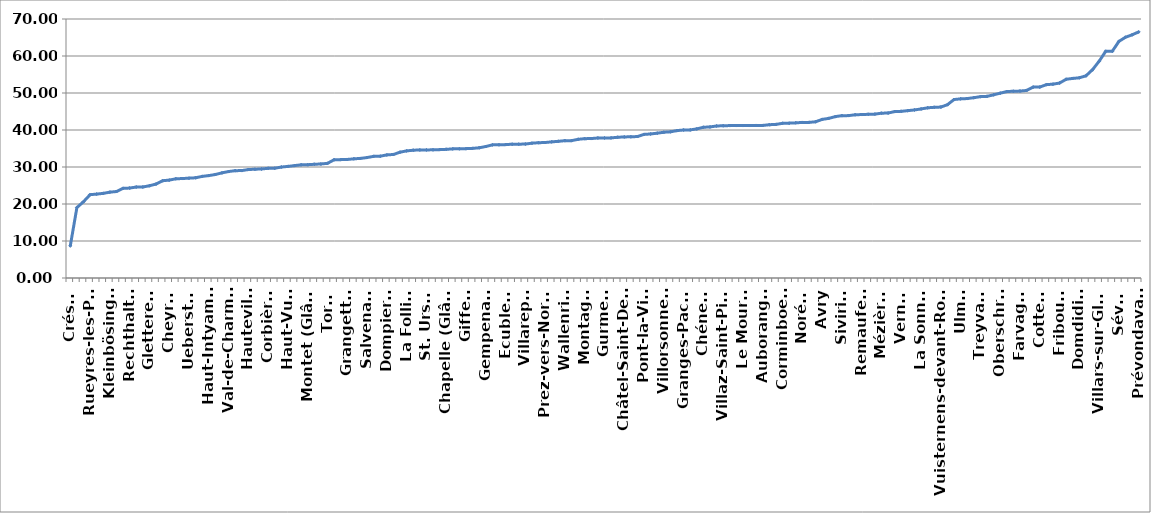
| Category | en francs par habitant |
|---|---|
| Crésuz | 8.683 |
| Delley-Portalban | 19.031 |
| Plasselb | 20.615 |
| Rueyres-les-Prés | 22.513 |
| Châtillon | 22.679 |
| Vuissens | 22.875 |
| Kleinbösingen | 23.202 |
| Courlevon | 23.372 |
| Châtel-sur-Montsalvens | 24.231 |
| Rechthalten | 24.304 |
| Galmiz | 24.586 |
| Bas-Intyamon | 24.599 |
| Gletterens | 24.93 |
| St. Silvester | 25.392 |
| St. Antoni | 26.294 |
| Cheyres | 26.452 |
| Plaffeien | 26.819 |
| Léchelles | 26.88 |
| Ueberstorf | 26.984 |
| Greng | 27.087 |
| Bussy | 27.46 |
| Haut-Intyamon | 27.679 |
| Les Montets | 27.978 |
| Chésopelloz | 28.416 |
| Val-de-Charmey | 28.768 |
| Botterens | 29.01 |
| Brünisried | 29.031 |
| Hauteville | 29.312 |
| Russy | 29.4 |
| Semsales | 29.467 |
| Corbières | 29.644 |
| Arconciel | 29.665 |
| Grandvillard | 29.987 |
| Haut-Vully | 30.16 |
| Rue | 30.379 |
| Senèdes | 30.588 |
| Montet (Glâne) | 30.62 |
| Alterswil | 30.736 |
| Heitenried | 30.815 |
| Torny | 30.991 |
| Corserey | 31.955 |
| Düdingen | 31.993 |
| Grangettes | 32.037 |
| Misery-Courtion | 32.209 |
| Ferpicloz | 32.32 |
| Salvenach | 32.556 |
| Barberêche | 32.879 |
| Autigny | 32.916 |
| Dompierre | 33.27 |
| Muntelier | 33.386 |
| Villeneuve | 34.006 |
| La Folliaz | 34.354 |
| Pont-en-Ogoz | 34.533 |
| Sorens | 34.612 |
| St. Ursen | 34.615 |
| Cheiry | 34.64 |
| Ponthaux | 34.696 |
| Chapelle (Glâne) | 34.774 |
| Riaz | 34.901 |
| Surpierre | 34.911 |
| Giffers | 34.961 |
| Ried bei Kerzers | 35.034 |
| Bösingen | 35.194 |
| Gempenach | 35.537 |
| Tentlingen | 35.979 |
| Le Glèbe | 36.006 |
| Ecublens | 36.049 |
| Saint-Aubin | 36.162 |
| Massonnens | 36.165 |
| Villarepos | 36.204 |
| Neyruz | 36.436 |
| Pierrafortscha | 36.564 |
| Prez-vers-Noréaz | 36.619 |
| Autafond | 36.797 |
| Châbles | 36.937 |
| Wallenried | 37.117 |
| Cugy | 37.128 |
| Corpataux-Magnedens | 37.484 |
| Montagny | 37.659 |
| Bas-Vully | 37.688 |
| Vallon | 37.842 |
| Gurmels | 37.845 |
| La Brillaz | 37.869 |
| Tafers | 38.032 |
| Châtel-Saint-Denis | 38.132 |
| Wünnewil-Flamatt | 38.157 |
| Murist | 38.237 |
| Pont-la-Ville | 38.81 |
| Schmitten | 38.933 |
| Gruyères | 39.139 |
| Villorsonnens | 39.396 |
| Morlon | 39.508 |
| Le Châtelard | 39.839 |
| Granges-Paccot | 40.004 |
| Villarsel-sur-Marly | 40.026 |
| Lully | 40.305 |
| Chénens | 40.738 |
| Givisiez | 40.827 |
| Vaulruz | 41.088 |
| Villaz-Saint-Pierre | 41.15 |
| Ependes | 41.194 |
| Hauterive | 41.206 |
| Le Mouret | 41.207 |
| Courgevaux | 41.212 |
| La Roche | 41.227 |
| Auboranges | 41.231 |
| Echarlens | 41.43 |
| Marly | 41.515 |
| Corminboeuf | 41.808 |
| Broc | 41.848 |
| Belfaux | 41.935 |
| Noréaz | 42.047 |
| Lurtigen | 42.057 |
| La Verrerie | 42.22 |
| Avry | 42.859 |
| Vuisternens-en-Ogoz | 43.142 |
| Jaun | 43.616 |
| Siviriez | 43.881 |
| Fétigny | 43.886 |
| Fräschels | 44.109 |
| Remaufens | 44.177 |
| Saint-Martin | 44.24 |
| Kerzers | 44.292 |
| Mézières | 44.543 |
| Grolley | 44.587 |
| Morens | 44.979 |
| Vernay | 45.042 |
| Le Flon | 45.234 |
| Bulle | 45.418 |
| La Sonnaz | 45.691 |
| Cressier | 45.997 |
| Ursy | 46.136 |
| Vuisternens-devant-Romont | 46.198 |
| Ménières | 46.843 |
| Nuvilly | 48.234 |
| Ulmiz | 48.419 |
| Romont | 48.499 |
| Granges | 48.734 |
| Treyvaux | 49.013 |
| Bossonnens | 49.092 |
| Murten | 49.507 |
| Oberschrot | 49.951 |
| Sâles | 50.389 |
| Attalens | 50.475 |
| Farvagny | 50.515 |
| Le Pâquier | 50.69 |
| Zumholz | 51.594 |
| Cottens | 51.606 |
| Rossens | 52.255 |
| Jeuss | 52.39 |
| Fribourg | 52.695 |
| Estavayer-le-Lac | 53.709 |
| Vuadens | 53.938 |
| Domdidier | 54.112 |
| Châtonnaye | 54.646 |
| Courtepin | 56.301 |
| Villars-sur-Glâne | 58.589 |
| Matran | 61.273 |
| Meyriez | 61.285 |
| Sévaz | 63.95 |
| Marsens | 65.07 |
| Billens-Hennens | 65.726 |
| Prévondavaux | 66.511 |